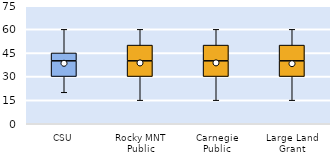
| Category | 25th | 50th | 75th |
|---|---|---|---|
| CSU | 30 | 10 | 5 |
| Rocky MNT Public | 30 | 10 | 10 |
| Carnegie Public | 30 | 10 | 10 |
| Large Land Grant | 30 | 10 | 10 |